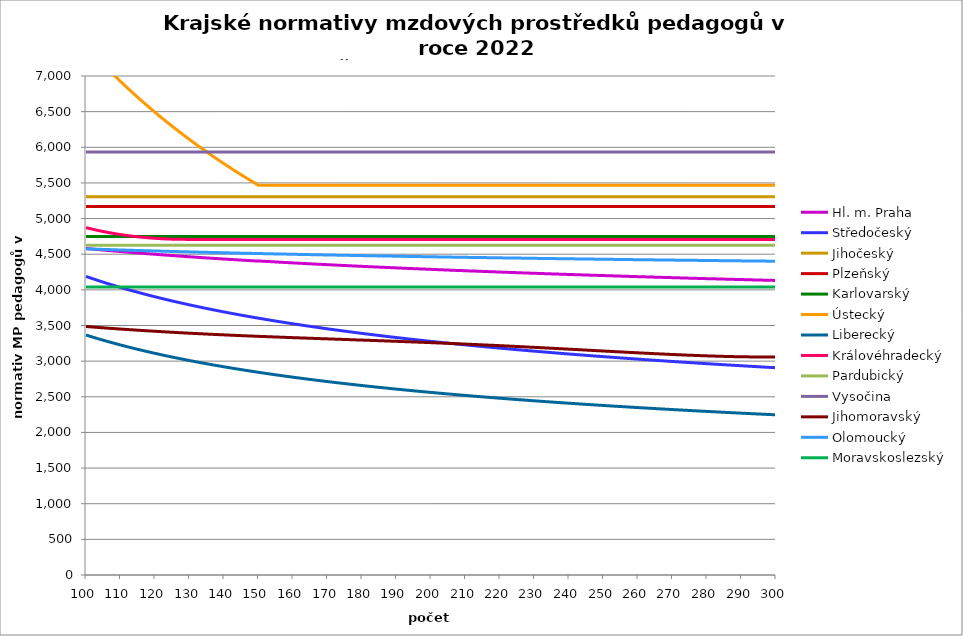
| Category | Hl. m. Praha | Středočeský | Jihočeský | Plzeňský | Karlovarský  | Ústecký   | Liberecký | Královéhradecký | Pardubický | Vysočina | Jihomoravský | Olomoucký | Moravskoslezský |
|---|---|---|---|---|---|---|---|---|---|---|---|---|---|
| 100.0 | 4580.626 | 4188.193 | 5305.814 | 5170.549 | 4750 | 7418.357 | 3366.367 | 4873.169 | 4624.066 | 5932.895 | 3485.683 | 4575.178 | 4040.705 |
| 101.0 | 4576.079 | 4171.55 | 5305.814 | 5170.549 | 4750 | 7365.745 | 3351.244 | 4861.061 | 4624.066 | 5932.895 | 3481.929 | 4573.697 | 4040.705 |
| 102.0 | 4571.542 | 4155.201 | 5305.814 | 5170.549 | 4750 | 7313.873 | 3336.402 | 4849.494 | 4624.066 | 5932.895 | 3478.183 | 4571.724 | 4040.705 |
| 103.0 | 4567.013 | 4139.137 | 5305.814 | 5170.549 | 4750 | 7262.727 | 3321.835 | 4838.461 | 4624.066 | 5932.895 | 3474.712 | 4570.246 | 4040.705 |
| 104.0 | 4562.945 | 4123.35 | 5305.814 | 5170.549 | 4750 | 7212.292 | 3307.533 | 4827.954 | 4624.066 | 5932.895 | 3470.982 | 4568.768 | 4040.705 |
| 105.0 | 4558.434 | 4107.833 | 5305.814 | 5170.549 | 4750 | 7162.552 | 3293.489 | 4817.967 | 4624.066 | 5932.895 | 3467.525 | 4567.292 | 4040.705 |
| 106.0 | 4554.381 | 4092.577 | 5305.814 | 5170.549 | 4750 | 7113.493 | 3279.695 | 4808.967 | 4624.066 | 5932.895 | 3463.81 | 4565.816 | 4040.705 |
| 107.0 | 4549.887 | 4077.577 | 5305.814 | 5170.549 | 4750 | 7065.102 | 3266.144 | 4800 | 4624.066 | 5932.895 | 3460.367 | 4564.341 | 4040.705 |
| 108.0 | 4545.849 | 4062.823 | 5305.814 | 5170.549 | 4750 | 7017.365 | 3252.829 | 4791.536 | 4624.066 | 5932.895 | 3456.931 | 4562.376 | 4040.705 |
| 109.0 | 4541.819 | 4048.311 | 5305.814 | 5170.549 | 4750 | 6970.268 | 3239.743 | 4783.102 | 4624.066 | 5932.895 | 3453.502 | 4560.904 | 4040.705 |
| 110.0 | 4537.795 | 4034.033 | 5305.814 | 5170.549 | 4750 | 6923.8 | 3226.88 | 4775.63 | 4624.066 | 5932.895 | 3450.08 | 4559.432 | 4040.705 |
| 111.0 | 4533.333 | 4019.983 | 5305.814 | 5170.549 | 4750 | 6877.947 | 3214.234 | 4768.646 | 4624.066 | 5932.895 | 3446.927 | 4557.962 | 4040.705 |
| 112.0 | 4529.77 | 4006.155 | 5305.814 | 5170.549 | 4750 | 6832.697 | 3201.799 | 4761.682 | 4624.066 | 5932.895 | 3443.518 | 4556.492 | 4040.705 |
| 113.0 | 4525.768 | 3992.544 | 5305.814 | 5170.549 | 4750 | 6788.039 | 3189.569 | 4755.664 | 4624.066 | 5932.895 | 3440.377 | 4555.023 | 4040.705 |
| 114.0 | 4521.773 | 3979.144 | 5305.814 | 5170.549 | 4750 | 6743.961 | 3177.539 | 4749.66 | 4624.066 | 5932.895 | 3437.242 | 4553.555 | 4040.705 |
| 115.0 | 4517.785 | 3965.949 | 5305.814 | 5170.549 | 4750 | 6700.452 | 3165.703 | 4744.132 | 4624.066 | 5932.895 | 3434.112 | 4552.577 | 4040.705 |
| 116.0 | 4513.805 | 3952.955 | 5305.814 | 5170.549 | 4750 | 6657.5 | 3154.056 | 4739.076 | 4624.066 | 5932.895 | 3430.988 | 4551.111 | 4040.705 |
| 117.0 | 4510.272 | 3940.156 | 5305.814 | 5170.549 | 4750 | 6615.096 | 3142.593 | 4734.488 | 4624.066 | 5932.895 | 3427.87 | 4549.646 | 4040.705 |
| 118.0 | 4506.304 | 3927.547 | 5305.814 | 5170.549 | 4750 | 6573.228 | 3131.31 | 4730.368 | 4624.066 | 5932.895 | 3424.758 | 4548.182 | 4040.705 |
| 119.0 | 4502.783 | 3915.124 | 5305.814 | 5170.549 | 4750 | 6531.887 | 3120.202 | 4726.71 | 4624.066 | 5932.895 | 3421.91 | 4546.718 | 4040.705 |
| 120.0 | 4499.268 | 3902.883 | 5305.814 | 5170.549 | 4750 | 6491.062 | 3109.265 | 4723.059 | 4624.066 | 5932.895 | 3419.066 | 4545.256 | 4040.705 |
| 121.0 | 4495.32 | 3890.818 | 5305.814 | 5170.549 | 4750 | 6450.745 | 3098.493 | 4719.869 | 4624.066 | 5932.895 | 3416.228 | 4544.281 | 4040.705 |
| 122.0 | 4491.816 | 3878.927 | 5305.814 | 5170.549 | 4750 | 6410.926 | 3087.884 | 4717.138 | 4624.066 | 5932.895 | 3413.394 | 4542.82 | 4040.705 |
| 123.0 | 4488.318 | 3867.204 | 5305.814 | 5170.549 | 4750 | 6371.595 | 3077.433 | 4714.864 | 4624.066 | 5932.895 | 3410.564 | 4541.36 | 4040.705 |
| 124.0 | 4484.825 | 3855.645 | 5305.814 | 5170.549 | 4750 | 6332.744 | 3067.136 | 4713.047 | 4624.066 | 5932.895 | 3407.74 | 4539.901 | 4040.705 |
| 125.0 | 4481.337 | 3844.248 | 5305.814 | 5170.549 | 4750 | 6294.364 | 3056.989 | 4711.231 | 4624.066 | 5932.895 | 3404.92 | 4538.929 | 4040.705 |
| 126.0 | 4477.855 | 3833.007 | 5305.814 | 5170.549 | 4750 | 6256.446 | 3046.99 | 4709.87 | 4624.066 | 5932.895 | 3402.36 | 4537.472 | 4040.705 |
| 127.0 | 4474.379 | 3821.921 | 5305.814 | 5170.549 | 4750 | 6218.982 | 3037.134 | 4708.963 | 4624.066 | 5932.895 | 3399.549 | 4536.015 | 4040.705 |
| 128.0 | 4470.908 | 3810.984 | 5305.814 | 5170.549 | 4750 | 6181.964 | 3027.418 | 4708.51 | 4624.066 | 5932.895 | 3396.998 | 4535.045 | 4040.705 |
| 129.0 | 4467.442 | 3800.195 | 5305.814 | 5170.549 | 4750 | 6145.385 | 3017.839 | 4708.057 | 4624.066 | 5932.895 | 3394.45 | 4533.59 | 4040.705 |
| 130.0 | 4463.981 | 3789.549 | 5305.814 | 5170.549 | 4750 | 6109.235 | 3008.394 | 4708.057 | 4624.066 | 5932.895 | 3391.906 | 4532.621 | 4040.705 |
| 131.0 | 4460.958 | 3779.043 | 5305.814 | 5170.549 | 4750 | 6073.509 | 2999.08 | 4708.057 | 4624.066 | 5932.895 | 3389.366 | 4531.167 | 4040.705 |
| 132.0 | 4457.507 | 3768.674 | 5305.814 | 5170.549 | 4750 | 6038.198 | 2989.893 | 4708.057 | 4624.066 | 5932.895 | 3387.084 | 4530.199 | 4040.705 |
| 133.0 | 4454.493 | 3758.44 | 5305.814 | 5170.549 | 4750 | 6003.295 | 2980.831 | 4708.057 | 4624.066 | 5932.895 | 3384.551 | 4528.747 | 4040.705 |
| 134.0 | 4451.052 | 3748.338 | 5305.814 | 5170.549 | 4750 | 5968.793 | 2971.891 | 4708.057 | 4624.066 | 5932.895 | 3382.275 | 4527.78 | 4040.705 |
| 135.0 | 4448.046 | 3738.364 | 5305.814 | 5170.549 | 4750 | 5934.686 | 2963.07 | 4708.057 | 4624.066 | 5932.895 | 3379.749 | 4526.329 | 4040.705 |
| 136.0 | 4444.616 | 3728.516 | 5305.814 | 5170.549 | 4750 | 5900.966 | 2954.366 | 4708.057 | 4624.066 | 5932.895 | 3377.479 | 4525.363 | 4040.705 |
| 137.0 | 4441.618 | 3718.791 | 5305.814 | 5170.549 | 4750 | 5867.627 | 2945.776 | 4708.057 | 4624.066 | 5932.895 | 3375.213 | 4523.914 | 4040.705 |
| 138.0 | 4438.625 | 3709.187 | 5305.814 | 5170.549 | 4750 | 5834.663 | 2937.298 | 4708.057 | 4624.066 | 5932.895 | 3372.949 | 4522.949 | 4040.705 |
| 139.0 | 4435.636 | 3699.702 | 5305.814 | 5170.549 | 4750 | 5802.067 | 2928.929 | 4708.057 | 4624.066 | 5932.895 | 3370.688 | 4521.502 | 4040.705 |
| 140.0 | 4432.225 | 3690.332 | 5305.814 | 5170.549 | 4750 | 5769.833 | 2920.668 | 4708.057 | 4624.066 | 5932.895 | 3368.681 | 4520.537 | 4040.705 |
| 141.0 | 4429.244 | 3681.076 | 5305.814 | 5170.549 | 4750 | 5737.956 | 2912.511 | 4708.057 | 4624.066 | 5932.895 | 3366.426 | 4519.574 | 4040.705 |
| 142.0 | 4426.267 | 3671.931 | 5305.814 | 5170.549 | 4750 | 5706.429 | 2904.456 | 4708.057 | 4624.066 | 5932.895 | 3364.174 | 4518.129 | 4040.705 |
| 143.0 | 4423.295 | 3662.895 | 5305.814 | 5170.549 | 4750 | 5675.246 | 2896.503 | 4708.057 | 4624.066 | 5932.895 | 3362.175 | 4517.166 | 4040.705 |
| 144.0 | 4420.326 | 3653.966 | 5305.814 | 5170.549 | 4750 | 5644.402 | 2888.647 | 4708.057 | 4624.066 | 5932.895 | 3360.178 | 4516.203 | 4040.705 |
| 145.0 | 4417.361 | 3645.142 | 5305.814 | 5170.549 | 4750 | 5613.892 | 2880.888 | 4708.057 | 4624.066 | 5932.895 | 3357.935 | 4514.76 | 4040.705 |
| 146.0 | 4414.401 | 3636.42 | 5305.814 | 5170.549 | 4750 | 5583.71 | 2873.224 | 4708.057 | 4624.066 | 5932.895 | 3355.943 | 4513.799 | 4040.705 |
| 147.0 | 4411.866 | 3627.799 | 5305.814 | 5170.549 | 4750 | 5553.85 | 2865.652 | 4708.057 | 4624.066 | 5932.895 | 3353.953 | 4512.838 | 4040.705 |
| 148.0 | 4408.913 | 3619.277 | 5305.814 | 5170.549 | 4750 | 5524.309 | 2858.171 | 4708.057 | 4624.066 | 5932.895 | 3351.966 | 4511.877 | 4040.705 |
| 149.0 | 4405.963 | 3610.852 | 5305.814 | 5170.549 | 4750 | 5495.079 | 2850.778 | 4708.057 | 4624.066 | 5932.895 | 3349.981 | 4510.437 | 4040.705 |
| 150.0 | 4405.121 | 3602.522 | 5305.814 | 5170.549 | 4750 | 5466.158 | 2843.473 | 4708.057 | 4624.066 | 5932.895 | 3347.999 | 4509.478 | 4040.705 |
| 151.0 | 4402.597 | 3594.285 | 5305.814 | 5170.549 | 4750 | 5466.158 | 2836.254 | 4708.057 | 4624.066 | 5932.895 | 3346.019 | 4508.519 | 4040.705 |
| 152.0 | 4399.656 | 3586.14 | 5305.814 | 5170.549 | 4750 | 5466.158 | 2829.118 | 4708.057 | 4624.066 | 5932.895 | 3344.288 | 4507.56 | 4040.705 |
| 153.0 | 4397.139 | 3578.085 | 5305.814 | 5170.549 | 4750 | 5466.158 | 2822.065 | 4708.057 | 4624.066 | 5932.895 | 3342.313 | 4506.122 | 4040.705 |
| 154.0 | 4394.205 | 3570.118 | 5305.814 | 5170.549 | 4750 | 5466.158 | 2815.092 | 4708.057 | 4624.066 | 5932.895 | 3340.586 | 4505.165 | 4040.705 |
| 155.0 | 4391.694 | 3562.238 | 5305.814 | 5170.549 | 4750 | 5466.158 | 2808.198 | 4708.057 | 4624.066 | 5932.895 | 3338.615 | 4504.207 | 4040.705 |
| 156.0 | 4388.767 | 3554.443 | 5305.814 | 5170.549 | 4750 | 5466.158 | 2801.383 | 4708.057 | 4624.066 | 5932.895 | 3336.892 | 4503.25 | 4040.705 |
| 157.0 | 4386.262 | 3546.731 | 5305.814 | 5170.549 | 4750 | 5466.158 | 2794.643 | 4708.057 | 4624.066 | 5932.895 | 3334.925 | 4502.294 | 4040.705 |
| 158.0 | 4383.343 | 3539.101 | 5305.814 | 5170.549 | 4750 | 5466.158 | 2787.978 | 4708.057 | 4624.066 | 5932.895 | 3333.206 | 4501.338 | 4040.705 |
| 159.0 | 4380.844 | 3531.552 | 5305.814 | 5170.549 | 4750 | 5466.158 | 2781.387 | 4708.057 | 4624.066 | 5932.895 | 3331.488 | 4500.382 | 4040.705 |
| 160.0 | 4378.348 | 3524.082 | 5305.814 | 5170.549 | 4750 | 5466.158 | 2774.868 | 4708.057 | 4624.066 | 5932.895 | 3329.528 | 4499.427 | 4040.705 |
| 161.0 | 4375.854 | 3516.69 | 5305.814 | 5170.549 | 4750 | 5466.158 | 2768.419 | 4708.057 | 4624.066 | 5932.895 | 3327.814 | 4497.995 | 4040.705 |
| 162.0 | 4372.949 | 3509.374 | 5305.814 | 5170.549 | 4750 | 5466.158 | 2762.04 | 4708.057 | 4624.066 | 5932.895 | 3326.102 | 4497.04 | 4040.705 |
| 163.0 | 4370.462 | 3502.133 | 5305.814 | 5170.549 | 4750 | 5466.158 | 2755.73 | 4708.057 | 4624.066 | 5932.895 | 3324.392 | 4496.087 | 4040.705 |
| 164.0 | 4367.977 | 3494.967 | 5305.814 | 5170.549 | 4750 | 5466.158 | 2749.487 | 4708.057 | 4624.066 | 5932.895 | 3322.684 | 4495.133 | 4040.705 |
| 165.0 | 4365.496 | 3487.872 | 5305.814 | 5170.549 | 4750 | 5466.158 | 2743.309 | 4708.057 | 4624.066 | 5932.895 | 3320.977 | 4494.18 | 4040.705 |
| 166.0 | 4363.017 | 3480.849 | 5305.814 | 5170.549 | 4750 | 5466.158 | 2737.196 | 4708.057 | 4624.066 | 5932.895 | 3319.273 | 4493.227 | 4040.705 |
| 167.0 | 4360.541 | 3473.897 | 5305.814 | 5170.549 | 4750 | 5466.158 | 2731.147 | 4708.057 | 4624.066 | 5932.895 | 3317.569 | 4492.275 | 4040.705 |
| 168.0 | 4358.068 | 3467.013 | 5305.814 | 5170.549 | 4750 | 5466.158 | 2725.161 | 4708.057 | 4624.066 | 5932.895 | 3315.868 | 4491.323 | 4040.705 |
| 169.0 | 4355.598 | 3460.197 | 5305.814 | 5170.549 | 4750 | 5466.158 | 2719.236 | 4708.057 | 4624.066 | 5932.895 | 3314.169 | 4490.372 | 4040.705 |
| 170.0 | 4353.13 | 3453.448 | 5305.814 | 5170.549 | 4750 | 5466.158 | 2713.371 | 4708.057 | 4624.066 | 5932.895 | 3312.471 | 4489.421 | 4040.705 |
| 171.0 | 4350.665 | 3446.764 | 5305.814 | 5170.549 | 4750 | 5466.158 | 2707.566 | 4708.057 | 4624.066 | 5932.895 | 3310.775 | 4488.47 | 4040.705 |
| 172.0 | 4348.613 | 3440.145 | 5305.814 | 5170.549 | 4750 | 5466.158 | 2701.819 | 4708.057 | 4624.066 | 5932.895 | 3309.08 | 4487.52 | 4040.705 |
| 173.0 | 4346.154 | 3433.59 | 5305.814 | 5170.549 | 4750 | 5466.158 | 2696.13 | 4708.057 | 4624.066 | 5932.895 | 3307.388 | 4487.045 | 4040.705 |
| 174.0 | 4343.697 | 3427.097 | 5305.814 | 5170.549 | 4750 | 5466.158 | 2690.497 | 4708.057 | 4624.066 | 5932.895 | 3305.697 | 4486.095 | 4040.705 |
| 175.0 | 4341.243 | 3420.665 | 5305.814 | 5170.549 | 4750 | 5466.158 | 2684.92 | 4708.057 | 4624.066 | 5932.895 | 3304.008 | 4485.146 | 4040.705 |
| 176.0 | 4339.2 | 3414.294 | 5305.814 | 5170.549 | 4750 | 5466.158 | 2679.397 | 4708.057 | 4624.066 | 5932.895 | 3302.32 | 4484.197 | 4040.705 |
| 177.0 | 4336.751 | 3407.983 | 5305.814 | 5170.549 | 4750 | 5466.158 | 2673.929 | 4708.057 | 4624.066 | 5932.895 | 3300.394 | 4483.249 | 4040.705 |
| 178.0 | 4334.305 | 3401.73 | 5305.814 | 5170.549 | 4750 | 5466.158 | 2668.513 | 4708.057 | 4624.066 | 5932.895 | 3298.71 | 4482.301 | 4040.705 |
| 179.0 | 4332.268 | 3395.536 | 5305.814 | 5170.549 | 4750 | 5466.158 | 2663.149 | 4708.057 | 4624.066 | 5932.895 | 3297.028 | 4481.353 | 4040.705 |
| 180.0 | 4329.827 | 3389.397 | 5305.814 | 5170.549 | 4750 | 5466.158 | 2657.836 | 4708.057 | 4624.066 | 5932.895 | 3295.348 | 4480.406 | 4040.705 |
| 181.0 | 4327.795 | 3383.315 | 5305.814 | 5170.549 | 4750 | 5466.158 | 2652.574 | 4708.057 | 4624.066 | 5932.895 | 3293.669 | 4479.459 | 4040.705 |
| 182.0 | 4325.359 | 3377.288 | 5305.814 | 5170.549 | 4750 | 5466.158 | 2647.361 | 4708.057 | 4624.066 | 5932.895 | 3291.992 | 4478.986 | 4040.705 |
| 183.0 | 4323.331 | 3371.316 | 5305.814 | 5170.549 | 4750 | 5466.158 | 2642.198 | 4708.057 | 4624.066 | 5932.895 | 3290.317 | 4478.04 | 4040.705 |
| 184.0 | 4320.9 | 3365.396 | 5305.814 | 5170.549 | 4750 | 5466.158 | 2637.082 | 4708.057 | 4624.066 | 5932.895 | 3288.643 | 4477.094 | 4040.705 |
| 185.0 | 4318.876 | 3359.53 | 5305.814 | 5170.549 | 4750 | 5466.158 | 2632.014 | 4708.057 | 4624.066 | 5932.895 | 3286.733 | 4476.148 | 4040.705 |
| 186.0 | 4316.45 | 3353.715 | 5305.814 | 5170.549 | 4750 | 5466.158 | 2626.992 | 4708.057 | 4624.066 | 5932.895 | 3285.063 | 4475.203 | 4040.705 |
| 187.0 | 4314.43 | 3347.951 | 5305.814 | 5170.549 | 4750 | 5466.158 | 2622.016 | 4708.057 | 4624.066 | 5932.895 | 3283.395 | 4474.731 | 4040.705 |
| 188.0 | 4312.412 | 3342.238 | 5305.814 | 5170.549 | 4750 | 5466.158 | 2617.085 | 4708.057 | 4624.066 | 5932.895 | 3281.491 | 4473.786 | 4040.705 |
| 189.0 | 4309.993 | 3336.575 | 5305.814 | 5170.549 | 4750 | 5466.158 | 2612.199 | 4708.057 | 4624.066 | 5932.895 | 3279.826 | 4472.842 | 4040.705 |
| 190.0 | 4307.98 | 3330.96 | 5305.814 | 5170.549 | 4750 | 5466.158 | 2607.357 | 4708.057 | 4624.066 | 5932.895 | 3277.926 | 4471.899 | 4040.705 |
| 191.0 | 4305.968 | 3325.393 | 5305.814 | 5170.549 | 4750 | 5466.158 | 2602.558 | 4708.057 | 4624.066 | 5932.895 | 3276.265 | 4471.427 | 4040.705 |
| 192.0 | 4303.958 | 3319.874 | 5305.814 | 5170.549 | 4750 | 5466.158 | 2597.801 | 4708.057 | 4624.066 | 5932.895 | 3274.369 | 4470.484 | 4040.705 |
| 193.0 | 4301.549 | 3314.402 | 5305.814 | 5170.549 | 4750 | 5466.158 | 2593.087 | 4708.057 | 4624.066 | 5932.895 | 3272.475 | 4469.541 | 4040.705 |
| 194.0 | 4299.543 | 3308.976 | 5305.814 | 5170.549 | 4750 | 5466.158 | 2588.414 | 4708.057 | 4624.066 | 5932.895 | 3270.819 | 4468.599 | 4040.705 |
| 195.0 | 4297.539 | 3303.595 | 5305.814 | 5170.549 | 4750 | 5466.158 | 2583.781 | 4708.057 | 4624.066 | 5932.895 | 3268.93 | 4468.128 | 4040.705 |
| 196.0 | 4295.537 | 3298.26 | 5305.814 | 5170.549 | 4750 | 5466.158 | 2579.189 | 4708.057 | 4624.066 | 5932.895 | 3267.042 | 4467.187 | 4040.705 |
| 197.0 | 4293.537 | 3292.968 | 5305.814 | 5170.549 | 4750 | 5466.158 | 2574.636 | 4708.057 | 4624.066 | 5932.895 | 3265.157 | 4466.245 | 4040.705 |
| 198.0 | 4291.539 | 3287.72 | 5305.814 | 5170.549 | 4750 | 5466.158 | 2570.122 | 4708.057 | 4624.066 | 5932.895 | 3263.273 | 4465.775 | 4040.705 |
| 199.0 | 4289.542 | 3282.515 | 5305.814 | 5170.549 | 4750 | 5466.158 | 2565.646 | 4708.057 | 4624.066 | 5932.895 | 3261.392 | 4464.834 | 4040.705 |
| 200.0 | 4287.548 | 3277.353 | 5305.814 | 5170.549 | 4750 | 5466.158 | 2561.209 | 4708.057 | 4624.066 | 5932.895 | 3259.513 | 4463.894 | 4040.705 |
| 201.0 | 4285.555 | 3272.232 | 5305.814 | 5170.549 | 4750 | 5466.158 | 2556.808 | 4708.057 | 4624.066 | 5932.895 | 3257.402 | 4463.424 | 4040.705 |
| 202.0 | 4283.564 | 3267.153 | 5305.814 | 5170.549 | 4750 | 5466.158 | 2552.445 | 4708.057 | 4624.066 | 5932.895 | 3255.528 | 4462.484 | 4040.705 |
| 203.0 | 4281.575 | 3262.114 | 5305.814 | 5170.549 | 4750 | 5466.158 | 2548.118 | 4708.057 | 4624.066 | 5932.895 | 3253.422 | 4461.545 | 4040.705 |
| 204.0 | 4279.588 | 3257.116 | 5305.814 | 5170.549 | 4750 | 5466.158 | 2543.827 | 4708.057 | 4624.066 | 5932.895 | 3251.552 | 4461.075 | 4040.705 |
| 205.0 | 4277.603 | 3252.157 | 5305.814 | 5170.549 | 4750 | 5466.158 | 2539.571 | 4708.057 | 4624.066 | 5932.895 | 3249.451 | 4460.137 | 4040.705 |
| 206.0 | 4275.619 | 3247.237 | 5305.814 | 5170.549 | 4750 | 5466.158 | 2535.349 | 4708.057 | 4624.066 | 5932.895 | 3247.586 | 4459.198 | 4040.705 |
| 207.0 | 4273.637 | 3242.356 | 5305.814 | 5170.549 | 4750 | 5466.158 | 2531.162 | 4708.057 | 4624.066 | 5932.895 | 3245.49 | 4458.729 | 4040.705 |
| 208.0 | 4271.658 | 3237.513 | 5305.814 | 5170.549 | 4750 | 5466.158 | 2527.009 | 4708.057 | 4624.066 | 5932.895 | 3243.397 | 4457.792 | 4040.705 |
| 209.0 | 4270.075 | 3232.708 | 5305.814 | 5170.549 | 4750 | 5466.158 | 2522.89 | 4708.057 | 4624.066 | 5932.895 | 3241.306 | 4457.323 | 4040.705 |
| 210.0 | 4268.099 | 3227.939 | 5305.814 | 5170.549 | 4750 | 5466.158 | 2518.803 | 4708.057 | 4624.066 | 5932.895 | 3239.218 | 4456.386 | 4040.705 |
| 211.0 | 4266.124 | 3223.207 | 5305.814 | 5170.549 | 4750 | 5466.158 | 2514.749 | 4708.057 | 4624.066 | 5932.895 | 3237.133 | 4455.449 | 4040.705 |
| 212.0 | 4264.151 | 3218.512 | 5305.814 | 5170.549 | 4750 | 5466.158 | 2510.727 | 4708.057 | 4624.066 | 5932.895 | 3234.82 | 4454.981 | 4040.705 |
| 213.0 | 4262.574 | 3213.852 | 5305.814 | 5170.549 | 4750 | 5466.158 | 2506.737 | 4708.057 | 4624.066 | 5932.895 | 3232.741 | 4454.045 | 4040.705 |
| 214.0 | 4260.604 | 3209.227 | 5305.814 | 5170.549 | 4750 | 5466.158 | 2502.778 | 4708.057 | 4624.066 | 5932.895 | 3230.664 | 4453.577 | 4040.705 |
| 215.0 | 4258.637 | 3204.637 | 5305.814 | 5170.549 | 4750 | 5466.158 | 2498.85 | 4708.057 | 4624.066 | 5932.895 | 3228.359 | 4452.642 | 4040.705 |
| 216.0 | 4257.064 | 3200.081 | 5305.814 | 5170.549 | 4750 | 5466.158 | 2494.952 | 4708.057 | 4624.066 | 5932.895 | 3226.058 | 4452.174 | 4040.705 |
| 217.0 | 4255.099 | 3195.559 | 5305.814 | 5170.549 | 4750 | 5466.158 | 2491.085 | 4708.057 | 4624.066 | 5932.895 | 3223.99 | 4451.239 | 4040.705 |
| 218.0 | 4253.529 | 3191.071 | 5305.814 | 5170.549 | 4750 | 5466.158 | 2487.247 | 4708.057 | 4624.066 | 5932.895 | 3221.695 | 4450.772 | 4040.705 |
| 219.0 | 4251.568 | 3186.615 | 5305.814 | 5170.549 | 4750 | 5466.158 | 2483.438 | 4708.057 | 4624.066 | 5932.895 | 3219.404 | 4449.837 | 4040.705 |
| 220.0 | 4249.608 | 3182.193 | 5305.814 | 5170.549 | 4750 | 5466.158 | 2479.658 | 4708.057 | 4624.066 | 5932.895 | 3217.116 | 4448.903 | 4040.705 |
| 221.0 | 4248.042 | 3177.802 | 5305.814 | 5170.549 | 4750 | 5466.158 | 2475.907 | 4708.057 | 4624.066 | 5932.895 | 3214.831 | 4448.437 | 4040.705 |
| 222.0 | 4246.086 | 3173.444 | 5305.814 | 5170.549 | 4750 | 5466.158 | 2472.184 | 4708.057 | 4624.066 | 5932.895 | 3212.549 | 4447.503 | 4040.705 |
| 223.0 | 4244.522 | 3169.116 | 5305.814 | 5170.549 | 4750 | 5466.158 | 2468.489 | 4708.057 | 4624.066 | 5932.895 | 3210.043 | 4447.037 | 4040.705 |
| 224.0 | 4242.569 | 3164.82 | 5305.814 | 5170.549 | 4750 | 5466.158 | 2464.821 | 4708.057 | 4624.066 | 5932.895 | 3207.768 | 4446.104 | 4040.705 |
| 225.0 | 4241.008 | 3160.555 | 5305.814 | 5170.549 | 4750 | 5466.158 | 2461.181 | 4708.057 | 4624.066 | 5932.895 | 3205.269 | 4445.638 | 4040.705 |
| 226.0 | 4239.058 | 3156.32 | 5305.814 | 5170.549 | 4750 | 5466.158 | 2457.567 | 4708.057 | 4624.066 | 5932.895 | 3203 | 4445.171 | 4040.705 |
| 227.0 | 4237.5 | 3152.115 | 5305.814 | 5170.549 | 4750 | 5466.158 | 2453.98 | 4708.057 | 4624.066 | 5932.895 | 3200.509 | 4444.239 | 4040.705 |
| 228.0 | 4235.943 | 3147.939 | 5305.814 | 5170.549 | 4750 | 5466.158 | 2450.419 | 4708.057 | 4624.066 | 5932.895 | 3198.022 | 4443.774 | 4040.705 |
| 229.0 | 4233.998 | 3143.793 | 5305.814 | 5170.549 | 4750 | 5466.158 | 2446.884 | 4708.057 | 4624.066 | 5932.895 | 3195.764 | 4442.842 | 4040.705 |
| 230.0 | 4232.443 | 3139.675 | 5305.814 | 5170.549 | 4750 | 5466.158 | 2443.374 | 4708.057 | 4624.066 | 5932.895 | 3193.283 | 4442.377 | 4040.705 |
| 231.0 | 4230.889 | 3135.586 | 5305.814 | 5170.549 | 4750 | 5466.158 | 2439.89 | 4708.057 | 4624.066 | 5932.895 | 3190.807 | 4441.446 | 4040.705 |
| 232.0 | 4228.949 | 3131.526 | 5305.814 | 5170.549 | 4750 | 5466.158 | 2436.43 | 4708.057 | 4624.066 | 5932.895 | 3188.335 | 4440.981 | 4040.705 |
| 233.0 | 4227.398 | 3127.493 | 5305.814 | 5170.549 | 4750 | 5466.158 | 2432.995 | 4708.057 | 4624.066 | 5932.895 | 3185.866 | 4440.05 | 4040.705 |
| 234.0 | 4225.848 | 3123.488 | 5305.814 | 5170.549 | 4750 | 5466.158 | 2429.584 | 4708.057 | 4624.066 | 5932.895 | 3183.177 | 4439.585 | 4040.705 |
| 235.0 | 4223.912 | 3119.51 | 5305.814 | 5170.549 | 4750 | 5466.158 | 2426.198 | 4708.057 | 4624.066 | 5932.895 | 3180.717 | 4439.12 | 4040.705 |
| 236.0 | 4222.365 | 3115.559 | 5305.814 | 5170.549 | 4750 | 5466.158 | 2422.835 | 4708.057 | 4624.066 | 5932.895 | 3178.26 | 4438.191 | 4040.705 |
| 237.0 | 4220.818 | 3111.635 | 5305.814 | 5170.549 | 4750 | 5466.158 | 2419.495 | 4708.057 | 4624.066 | 5932.895 | 3175.584 | 4437.726 | 4040.705 |
| 238.0 | 4219.273 | 3107.737 | 5305.814 | 5170.549 | 4750 | 5466.158 | 2416.179 | 4708.057 | 4624.066 | 5932.895 | 3173.135 | 4436.797 | 4040.705 |
| 239.0 | 4217.729 | 3103.865 | 5305.814 | 5170.549 | 4750 | 5466.158 | 2412.886 | 4708.057 | 4624.066 | 5932.895 | 3170.468 | 4436.333 | 4040.705 |
| 240.0 | 4215.801 | 3100.019 | 5305.814 | 5170.549 | 4750 | 5466.158 | 2409.615 | 4708.057 | 4624.066 | 5932.895 | 3168.027 | 4435.405 | 4040.705 |
| 241.0 | 4214.26 | 3096.198 | 5305.814 | 5170.549 | 4750 | 5466.158 | 2406.367 | 4708.057 | 4624.066 | 5932.895 | 3165.368 | 4434.941 | 4040.705 |
| 242.0 | 4212.719 | 3092.403 | 5305.814 | 5170.549 | 4750 | 5466.158 | 2403.141 | 4708.057 | 4624.066 | 5932.895 | 3162.714 | 4434.477 | 4040.705 |
| 243.0 | 4211.18 | 3088.632 | 5305.814 | 5170.549 | 4750 | 5466.158 | 2399.937 | 4708.057 | 4624.066 | 5932.895 | 3160.285 | 4433.549 | 4040.705 |
| 244.0 | 4209.642 | 3084.886 | 5305.814 | 5170.549 | 4750 | 5466.158 | 2396.754 | 4708.057 | 4624.066 | 5932.895 | 3157.639 | 4433.086 | 4040.705 |
| 245.0 | 4208.105 | 3081.164 | 5305.814 | 5170.549 | 4750 | 5466.158 | 2393.593 | 4708.057 | 4624.066 | 5932.895 | 3154.998 | 4432.622 | 4040.705 |
| 246.0 | 4206.569 | 3077.467 | 5305.814 | 5170.549 | 4750 | 5466.158 | 2390.453 | 4708.057 | 4624.066 | 5932.895 | 3152.361 | 4431.696 | 4040.705 |
| 247.0 | 4205.035 | 3073.793 | 5305.814 | 5170.549 | 4750 | 5466.158 | 2387.334 | 4708.057 | 4624.066 | 5932.895 | 3149.729 | 4431.232 | 4040.705 |
| 248.0 | 4203.501 | 3070.143 | 5305.814 | 5170.549 | 4750 | 5466.158 | 2384.236 | 4708.057 | 4624.066 | 5932.895 | 3147.101 | 4430.769 | 4040.705 |
| 249.0 | 4201.969 | 3066.516 | 5305.814 | 5170.549 | 4750 | 5466.158 | 2381.158 | 4708.057 | 4624.066 | 5932.895 | 3144.695 | 4429.843 | 4040.705 |
| 250.0 | 4200.437 | 3062.912 | 5305.814 | 5170.549 | 4750 | 5466.158 | 2378.1 | 4708.057 | 4624.066 | 5932.895 | 3142.076 | 4429.38 | 4040.705 |
| 251.0 | 4198.907 | 3059.33 | 5305.814 | 5170.549 | 4750 | 5466.158 | 2375.062 | 4708.057 | 4624.066 | 5932.895 | 3139.46 | 4428.918 | 4040.705 |
| 252.0 | 4197.378 | 3055.772 | 5305.814 | 5170.549 | 4750 | 5466.158 | 2372.044 | 4708.057 | 4624.066 | 5932.895 | 3136.849 | 4427.992 | 4040.705 |
| 253.0 | 4195.85 | 3052.236 | 5305.814 | 5170.549 | 4750 | 5466.158 | 2369.046 | 4708.057 | 4624.066 | 5932.895 | 3134.243 | 4427.53 | 4040.705 |
| 254.0 | 4194.323 | 3048.721 | 5305.814 | 5170.549 | 4750 | 5466.158 | 2366.067 | 4708.057 | 4624.066 | 5932.895 | 3131.64 | 4427.068 | 4040.705 |
| 255.0 | 4192.797 | 3045.229 | 5305.814 | 5170.549 | 4750 | 5466.158 | 2363.107 | 4708.057 | 4624.066 | 5932.895 | 3129.259 | 4426.143 | 4040.705 |
| 256.0 | 4191.273 | 3041.758 | 5305.814 | 5170.549 | 4750 | 5466.158 | 2360.166 | 4708.057 | 4624.066 | 5932.895 | 3126.665 | 4425.681 | 4040.705 |
| 257.0 | 4189.749 | 3038.309 | 5305.814 | 5170.549 | 4750 | 5466.158 | 2357.244 | 4708.057 | 4624.066 | 5932.895 | 3124.075 | 4425.219 | 4040.705 |
| 258.0 | 4188.227 | 3034.881 | 5305.814 | 5170.549 | 4750 | 5466.158 | 2354.34 | 4708.057 | 4624.066 | 5932.895 | 3121.49 | 4424.296 | 4040.705 |
| 259.0 | 4186.705 | 3031.474 | 5305.814 | 5170.549 | 4750 | 5466.158 | 2351.455 | 4708.057 | 4624.066 | 5932.895 | 3119.123 | 4423.834 | 4040.705 |
| 260.0 | 4185.185 | 3028.087 | 5305.814 | 5170.549 | 4750 | 5466.158 | 2348.588 | 4708.057 | 4624.066 | 5932.895 | 3116.546 | 4423.372 | 4040.705 |
| 261.0 | 4183.666 | 3024.721 | 5305.814 | 5170.549 | 4750 | 5466.158 | 2345.739 | 4708.057 | 4624.066 | 5932.895 | 3114.187 | 4422.911 | 4040.705 |
| 262.0 | 4182.527 | 3021.375 | 5305.814 | 5170.549 | 4750 | 5466.158 | 2342.907 | 4708.057 | 4624.066 | 5932.895 | 3111.618 | 4421.988 | 4040.705 |
| 263.0 | 4181.01 | 3018.05 | 5305.814 | 5170.549 | 4750 | 5466.158 | 2340.093 | 4708.057 | 4624.066 | 5932.895 | 3109.267 | 4421.527 | 4040.705 |
| 264.0 | 4179.494 | 3014.744 | 5305.814 | 5170.549 | 4750 | 5466.158 | 2337.297 | 4708.057 | 4624.066 | 5932.895 | 3106.919 | 4421.066 | 4040.705 |
| 265.0 | 4177.979 | 3011.458 | 5305.814 | 5170.549 | 4750 | 5466.158 | 2334.517 | 4708.057 | 4624.066 | 5932.895 | 3104.575 | 4420.144 | 4040.705 |
| 266.0 | 4176.844 | 3008.192 | 5305.814 | 5170.549 | 4750 | 5466.158 | 2331.755 | 4708.057 | 4624.066 | 5932.895 | 3102.234 | 4419.683 | 4040.705 |
| 267.0 | 4175.331 | 3004.944 | 5305.814 | 5170.549 | 4750 | 5466.158 | 2329.01 | 4708.057 | 4624.066 | 5932.895 | 3099.897 | 4419.222 | 4040.705 |
| 268.0 | 4173.819 | 3001.716 | 5305.814 | 5170.549 | 4750 | 5466.158 | 2326.281 | 4708.057 | 4624.066 | 5932.895 | 3097.776 | 4418.762 | 4040.705 |
| 269.0 | 4172.308 | 2998.507 | 5305.814 | 5170.549 | 4750 | 5466.158 | 2323.569 | 4708.057 | 4624.066 | 5932.895 | 3095.445 | 4418.301 | 4040.705 |
| 270.0 | 4171.175 | 2995.317 | 5305.814 | 5170.549 | 4750 | 5466.158 | 2320.873 | 4708.057 | 4624.066 | 5932.895 | 3093.33 | 4417.38 | 4040.705 |
| 271.0 | 4169.666 | 2992.145 | 5305.814 | 5170.549 | 4750 | 5466.158 | 2318.193 | 4708.057 | 4624.066 | 5932.895 | 3091.217 | 4416.92 | 4040.705 |
| 272.0 | 4168.158 | 2988.991 | 5305.814 | 5170.549 | 4750 | 5466.158 | 2315.53 | 4708.057 | 4624.066 | 5932.895 | 3089.107 | 4416.46 | 4040.705 |
| 273.0 | 4167.028 | 2985.856 | 5305.814 | 5170.549 | 4750 | 5466.158 | 2312.882 | 4708.057 | 4624.066 | 5932.895 | 3087 | 4416 | 4040.705 |
| 274.0 | 4165.522 | 2982.738 | 5305.814 | 5170.549 | 4750 | 5466.158 | 2310.25 | 4708.057 | 4624.066 | 5932.895 | 3084.896 | 4415.08 | 4040.705 |
| 275.0 | 4164.017 | 2979.639 | 5305.814 | 5170.549 | 4750 | 5466.158 | 2307.633 | 4708.057 | 4624.066 | 5932.895 | 3083.005 | 4414.62 | 4040.705 |
| 276.0 | 4162.889 | 2976.557 | 5305.814 | 5170.549 | 4750 | 5466.158 | 2305.032 | 4708.057 | 4624.066 | 5932.895 | 3081.116 | 4414.161 | 4040.705 |
| 277.0 | 4161.386 | 2973.492 | 5305.814 | 5170.549 | 4750 | 5466.158 | 2302.446 | 4708.057 | 4624.066 | 5932.895 | 3079.23 | 4413.701 | 4040.705 |
| 278.0 | 4159.885 | 2970.445 | 5305.814 | 5170.549 | 4750 | 5466.158 | 2299.875 | 4708.057 | 4624.066 | 5932.895 | 3077.346 | 4413.242 | 4040.705 |
| 279.0 | 4158.759 | 2967.415 | 5305.814 | 5170.549 | 4750 | 5466.158 | 2297.319 | 4708.057 | 4624.066 | 5932.895 | 3075.673 | 4412.323 | 4040.705 |
| 280.0 | 4157.259 | 2964.402 | 5305.814 | 5170.549 | 4750 | 5466.158 | 2294.778 | 4708.057 | 4624.066 | 5932.895 | 3074.002 | 4411.864 | 4040.705 |
| 281.0 | 4156.134 | 2961.406 | 5305.814 | 5170.549 | 4750 | 5466.158 | 2292.252 | 4708.057 | 4624.066 | 5932.895 | 3072.332 | 4411.405 | 4040.705 |
| 282.0 | 4154.636 | 2958.426 | 5305.814 | 5170.549 | 4750 | 5466.158 | 2289.74 | 4708.057 | 4624.066 | 5932.895 | 3070.873 | 4410.946 | 4040.705 |
| 283.0 | 4153.514 | 2955.463 | 5305.814 | 5170.549 | 4750 | 5466.158 | 2287.242 | 4708.057 | 4624.066 | 5932.895 | 3069.415 | 4410.487 | 4040.705 |
| 284.0 | 4152.017 | 2952.517 | 5305.814 | 5170.549 | 4750 | 5466.158 | 2284.758 | 4708.057 | 4624.066 | 5932.895 | 3067.959 | 4409.569 | 4040.705 |
| 285.0 | 4150.896 | 2949.586 | 5305.814 | 5170.549 | 4750 | 5466.158 | 2282.289 | 4708.057 | 4624.066 | 5932.895 | 3066.712 | 4409.111 | 4040.705 |
| 286.0 | 4149.401 | 2946.672 | 5305.814 | 5170.549 | 4750 | 5466.158 | 2279.834 | 4708.057 | 4624.066 | 5932.895 | 3065.466 | 4408.652 | 4040.705 |
| 287.0 | 4148.281 | 2943.773 | 5305.814 | 5170.549 | 4750 | 5466.158 | 2277.392 | 4708.057 | 4624.066 | 5932.895 | 3064.22 | 4408.194 | 4040.705 |
| 288.0 | 4146.789 | 2940.89 | 5305.814 | 5170.549 | 4750 | 5466.158 | 2274.964 | 4708.057 | 4624.066 | 5932.895 | 3063.184 | 4407.735 | 4040.705 |
| 289.0 | 4145.67 | 2938.023 | 5305.814 | 5170.549 | 4750 | 5466.158 | 2272.55 | 4708.057 | 4624.066 | 5932.895 | 3062.147 | 4407.277 | 4040.705 |
| 290.0 | 4144.18 | 2935.172 | 5305.814 | 5170.549 | 4750 | 5466.158 | 2270.149 | 4708.057 | 4624.066 | 5932.895 | 3061.319 | 4406.361 | 4040.705 |
| 291.0 | 4143.063 | 2932.335 | 5305.814 | 5170.549 | 4750 | 5466.158 | 2267.762 | 4708.057 | 4624.066 | 5932.895 | 3060.491 | 4405.903 | 4040.705 |
| 292.0 | 4141.574 | 2929.514 | 5305.814 | 5170.549 | 4750 | 5466.158 | 2265.387 | 4708.057 | 4624.066 | 5932.895 | 3059.87 | 4405.445 | 4040.705 |
| 293.0 | 4140.458 | 2926.708 | 5305.814 | 5170.549 | 4750 | 5466.158 | 2263.026 | 4708.057 | 4624.066 | 5932.895 | 3059.25 | 4404.988 | 4040.705 |
| 294.0 | 4138.971 | 2923.916 | 5305.814 | 5170.549 | 4750 | 5466.158 | 2260.678 | 4708.057 | 4624.066 | 5932.895 | 3058.836 | 4404.53 | 4040.705 |
| 295.0 | 4137.857 | 2921.14 | 5305.814 | 5170.549 | 4750 | 5466.158 | 2258.342 | 4708.057 | 4624.066 | 5932.895 | 3058.423 | 4404.072 | 4040.705 |
| 296.0 | 4136.743 | 2918.378 | 5305.814 | 5170.549 | 4750 | 5466.158 | 2256.019 | 4708.057 | 4624.066 | 5932.895 | 3058.216 | 4403.615 | 4040.705 |
| 297.0 | 4135.259 | 2915.631 | 5305.814 | 5170.549 | 4750 | 5466.158 | 2253.709 | 4708.057 | 4624.066 | 5932.895 | 3058.01 | 4403.157 | 4040.705 |
| 298.0 | 4134.146 | 2912.898 | 5305.814 | 5170.549 | 4750 | 5466.158 | 2251.411 | 4708.057 | 4624.066 | 5932.895 | 3058.01 | 4402.243 | 4040.705 |
| 299.0 | 4133.035 | 2910.179 | 5305.814 | 5170.549 | 4750 | 5466.158 | 2249.126 | 4708.057 | 4624.066 | 5932.895 | 3058.01 | 4401.786 | 4040.705 |
| 300.0 | 4131.553 | 2907.474 | 5305.814 | 5170.549 | 4750 | 5466.158 | 2246.852 | 4708.057 | 4624.066 | 5932.895 | 3058.01 | 4401.329 | 4040.705 |